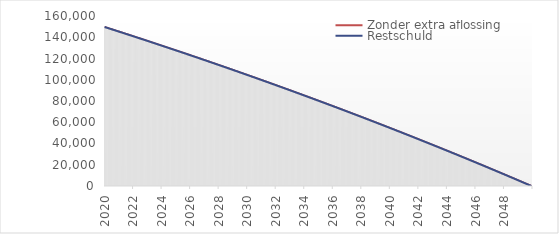
| Category | Zonder extra aflossing | Restschuld |
|---|---|---|
| 2020-01-01 | 149642.54 | 149642.54 |
| 2020-02-01 | 149284.78 | 149284.78 |
| 2020-03-01 | 148926.72 | 148926.72 |
| 2020-04-01 | 148568.37 | 148568.37 |
| 2020-05-01 | 148209.72 | 148209.72 |
| 2020-06-01 | 147850.77 | 147850.77 |
| 2020-07-01 | 147491.52 | 147491.52 |
| 2020-08-01 | 147131.97 | 147131.97 |
| 2020-09-01 | 146772.12 | 146772.12 |
| 2020-10-01 | 146411.97 | 146411.97 |
| 2020-11-01 | 146051.52 | 146051.52 |
| 2020-12-01 | 145690.77 | 145690.77 |
| 2021-01-01 | 145329.72 | 145329.72 |
| 2021-02-01 | 144968.37 | 144968.37 |
| 2021-03-01 | 144606.72 | 144606.72 |
| 2021-04-01 | 144244.77 | 144244.77 |
| 2021-05-01 | 143882.51 | 143882.51 |
| 2021-06-01 | 143519.95 | 143519.95 |
| 2021-07-01 | 143157.09 | 143157.09 |
| 2021-08-01 | 142793.93 | 142793.93 |
| 2021-09-01 | 142430.46 | 142430.46 |
| 2021-10-01 | 142066.69 | 142066.69 |
| 2021-11-01 | 141702.62 | 141702.62 |
| 2021-12-01 | 141338.25 | 141338.25 |
| 2022-01-01 | 140973.57 | 140973.57 |
| 2022-02-01 | 140608.59 | 140608.59 |
| 2022-03-01 | 140243.3 | 140243.3 |
| 2022-04-01 | 139877.71 | 139877.71 |
| 2022-05-01 | 139511.81 | 139511.81 |
| 2022-06-01 | 139145.61 | 139145.61 |
| 2022-07-01 | 138779.1 | 138779.1 |
| 2022-08-01 | 138412.29 | 138412.29 |
| 2022-09-01 | 138045.17 | 138045.17 |
| 2022-10-01 | 137677.75 | 137677.75 |
| 2022-11-01 | 137310.02 | 137310.02 |
| 2022-12-01 | 136941.99 | 136941.99 |
| 2023-01-01 | 136573.65 | 136573.65 |
| 2023-02-01 | 136205 | 136205 |
| 2023-03-01 | 135836.04 | 135836.04 |
| 2023-04-01 | 135466.78 | 135466.78 |
| 2023-05-01 | 135097.21 | 135097.21 |
| 2023-06-01 | 134727.33 | 134727.33 |
| 2023-07-01 | 134357.14 | 134357.14 |
| 2023-08-01 | 133986.64 | 133986.64 |
| 2023-09-01 | 133615.84 | 133615.84 |
| 2023-10-01 | 133244.73 | 133244.73 |
| 2023-11-01 | 132873.31 | 132873.31 |
| 2023-12-01 | 132501.58 | 132501.58 |
| 2024-01-01 | 132129.54 | 132129.54 |
| 2024-02-01 | 131757.19 | 131757.19 |
| 2024-03-01 | 131384.53 | 131384.53 |
| 2024-04-01 | 131011.56 | 131011.56 |
| 2024-05-01 | 130638.28 | 130638.28 |
| 2024-06-01 | 130264.69 | 130264.69 |
| 2024-07-01 | 129890.78 | 129890.78 |
| 2024-08-01 | 129516.56 | 129516.56 |
| 2024-09-01 | 129142.03 | 129142.03 |
| 2024-10-01 | 128767.19 | 128767.19 |
| 2024-11-01 | 128392.04 | 128392.04 |
| 2024-12-01 | 128016.57 | 128016.57 |
| 2025-01-01 | 127640.79 | 127640.79 |
| 2025-02-01 | 127264.7 | 127264.7 |
| 2025-03-01 | 126888.29 | 126888.29 |
| 2025-04-01 | 126511.57 | 126511.57 |
| 2025-05-01 | 126134.54 | 126134.54 |
| 2025-06-01 | 125757.19 | 125757.19 |
| 2025-07-01 | 125379.53 | 125379.53 |
| 2025-08-01 | 125001.55 | 125001.55 |
| 2025-09-01 | 124623.26 | 124623.26 |
| 2025-10-01 | 124244.65 | 124244.65 |
| 2025-11-01 | 123865.73 | 123865.73 |
| 2025-12-01 | 123486.49 | 123486.49 |
| 2026-01-01 | 123106.94 | 123106.94 |
| 2026-02-01 | 122727.07 | 122727.07 |
| 2026-03-01 | 122346.88 | 122346.88 |
| 2026-04-01 | 121966.38 | 121966.38 |
| 2026-05-01 | 121585.56 | 121585.56 |
| 2026-06-01 | 121204.42 | 121204.42 |
| 2026-07-01 | 120822.96 | 120822.96 |
| 2026-08-01 | 120441.19 | 120441.19 |
| 2026-09-01 | 120059.1 | 120059.1 |
| 2026-10-01 | 119676.69 | 119676.69 |
| 2026-11-01 | 119293.96 | 119293.96 |
| 2026-12-01 | 118910.91 | 118910.91 |
| 2027-01-01 | 118527.54 | 118527.54 |
| 2027-02-01 | 118143.85 | 118143.85 |
| 2027-03-01 | 117759.84 | 117759.84 |
| 2027-04-01 | 117375.51 | 117375.51 |
| 2027-05-01 | 116990.86 | 116990.86 |
| 2027-06-01 | 116605.89 | 116605.89 |
| 2027-07-01 | 116220.6 | 116220.6 |
| 2027-08-01 | 115834.99 | 115834.99 |
| 2027-09-01 | 115449.06 | 115449.06 |
| 2027-10-01 | 115062.81 | 115062.81 |
| 2027-11-01 | 114676.24 | 114676.24 |
| 2027-12-01 | 114289.34 | 114289.34 |
| 2028-01-01 | 113902.12 | 113902.12 |
| 2028-02-01 | 113514.58 | 113514.58 |
| 2028-03-01 | 113126.72 | 113126.72 |
| 2028-04-01 | 112738.53 | 112738.53 |
| 2028-05-01 | 112350.02 | 112350.02 |
| 2028-06-01 | 111961.19 | 111961.19 |
| 2028-07-01 | 111572.03 | 111572.03 |
| 2028-08-01 | 111182.55 | 111182.55 |
| 2028-09-01 | 110792.74 | 110792.74 |
| 2028-10-01 | 110402.61 | 110402.61 |
| 2028-11-01 | 110012.15 | 110012.15 |
| 2028-12-01 | 109621.37 | 109621.37 |
| 2029-01-01 | 109230.26 | 109230.26 |
| 2029-02-01 | 108838.83 | 108838.83 |
| 2029-03-01 | 108447.07 | 108447.07 |
| 2029-04-01 | 108054.98 | 108054.98 |
| 2029-05-01 | 107662.57 | 107662.57 |
| 2029-06-01 | 107269.83 | 107269.83 |
| 2029-07-01 | 106876.76 | 106876.76 |
| 2029-08-01 | 106483.36 | 106483.36 |
| 2029-09-01 | 106089.64 | 106089.64 |
| 2029-10-01 | 105695.59 | 105695.59 |
| 2029-11-01 | 105301.21 | 105301.21 |
| 2029-12-01 | 104906.5 | 104906.5 |
| 2030-01-01 | 104511.46 | 104511.46 |
| 2030-02-01 | 104116.09 | 104116.09 |
| 2030-03-01 | 103720.39 | 103720.39 |
| 2030-04-01 | 103324.36 | 103324.36 |
| 2030-05-01 | 102928 | 102928 |
| 2030-06-01 | 102531.31 | 102531.31 |
| 2030-07-01 | 102134.29 | 102134.29 |
| 2030-08-01 | 101736.94 | 101736.94 |
| 2030-09-01 | 101339.26 | 101339.26 |
| 2030-10-01 | 100941.25 | 100941.25 |
| 2030-11-01 | 100542.91 | 100542.91 |
| 2030-12-01 | 100144.24 | 100144.24 |
| 2031-01-01 | 99745.23 | 99745.23 |
| 2031-02-01 | 99345.89 | 99345.89 |
| 2031-03-01 | 98946.22 | 98946.22 |
| 2031-04-01 | 98546.22 | 98546.22 |
| 2031-05-01 | 98145.88 | 98145.88 |
| 2031-06-01 | 97745.21 | 97745.21 |
| 2031-07-01 | 97344.2 | 97344.2 |
| 2031-08-01 | 96942.86 | 96942.86 |
| 2031-09-01 | 96541.19 | 96541.19 |
| 2031-10-01 | 96139.18 | 96139.18 |
| 2031-11-01 | 95736.84 | 95736.84 |
| 2031-12-01 | 95334.16 | 95334.16 |
| 2032-01-01 | 94931.15 | 94931.15 |
| 2032-02-01 | 94527.8 | 94527.8 |
| 2032-03-01 | 94124.11 | 94124.11 |
| 2032-04-01 | 93720.09 | 93720.09 |
| 2032-05-01 | 93315.73 | 93315.73 |
| 2032-06-01 | 92911.03 | 92911.03 |
| 2032-07-01 | 92506 | 92506 |
| 2032-08-01 | 92100.63 | 92100.63 |
| 2032-09-01 | 91694.92 | 91694.92 |
| 2032-10-01 | 91288.87 | 91288.87 |
| 2032-11-01 | 90882.48 | 90882.48 |
| 2032-12-01 | 90475.76 | 90475.76 |
| 2033-01-01 | 90068.7 | 90068.7 |
| 2033-02-01 | 89661.3 | 89661.3 |
| 2033-03-01 | 89253.56 | 89253.56 |
| 2033-04-01 | 88845.48 | 88845.48 |
| 2033-05-01 | 88437.06 | 88437.06 |
| 2033-06-01 | 88028.3 | 88028.3 |
| 2033-07-01 | 87619.2 | 87619.2 |
| 2033-08-01 | 87209.76 | 87209.76 |
| 2033-09-01 | 86799.97 | 86799.97 |
| 2033-10-01 | 86389.84 | 86389.84 |
| 2033-11-01 | 85979.37 | 85979.37 |
| 2033-12-01 | 85568.56 | 85568.56 |
| 2034-01-01 | 85157.41 | 85157.41 |
| 2034-02-01 | 84745.91 | 84745.91 |
| 2034-03-01 | 84334.07 | 84334.07 |
| 2034-04-01 | 83921.89 | 83921.89 |
| 2034-05-01 | 83509.36 | 83509.36 |
| 2034-06-01 | 83096.49 | 83096.49 |
| 2034-07-01 | 82683.28 | 82683.28 |
| 2034-08-01 | 82269.72 | 82269.72 |
| 2034-09-01 | 81855.82 | 81855.82 |
| 2034-10-01 | 81441.57 | 81441.57 |
| 2034-11-01 | 81026.98 | 81026.98 |
| 2034-12-01 | 80612.04 | 80612.04 |
| 2035-01-01 | 80196.76 | 80196.76 |
| 2035-02-01 | 79781.13 | 79781.13 |
| 2035-03-01 | 79365.15 | 79365.15 |
| 2035-04-01 | 78948.83 | 78948.83 |
| 2035-05-01 | 78532.16 | 78532.16 |
| 2035-06-01 | 78115.14 | 78115.14 |
| 2035-07-01 | 77697.78 | 77697.78 |
| 2035-08-01 | 77280.07 | 77280.07 |
| 2035-09-01 | 76862.01 | 76862.01 |
| 2035-10-01 | 76443.6 | 76443.6 |
| 2035-11-01 | 76024.84 | 76024.84 |
| 2035-12-01 | 75605.73 | 75605.73 |
| 2036-01-01 | 75186.27 | 75186.27 |
| 2036-02-01 | 74766.47 | 74766.47 |
| 2036-03-01 | 74346.32 | 74346.32 |
| 2036-04-01 | 73925.82 | 73925.82 |
| 2036-05-01 | 73504.96 | 73504.96 |
| 2036-06-01 | 73083.75 | 73083.75 |
| 2036-07-01 | 72662.19 | 72662.19 |
| 2036-08-01 | 72240.28 | 72240.28 |
| 2036-09-01 | 71818.02 | 71818.02 |
| 2036-10-01 | 71395.41 | 71395.41 |
| 2036-11-01 | 70972.45 | 70972.45 |
| 2036-12-01 | 70549.13 | 70549.13 |
| 2037-01-01 | 70125.46 | 70125.46 |
| 2037-02-01 | 69701.44 | 69701.44 |
| 2037-03-01 | 69277.06 | 69277.06 |
| 2037-04-01 | 68852.33 | 68852.33 |
| 2037-05-01 | 68427.25 | 68427.25 |
| 2037-06-01 | 68001.81 | 68001.81 |
| 2037-07-01 | 67576.02 | 67576.02 |
| 2037-08-01 | 67149.87 | 67149.87 |
| 2037-09-01 | 66723.37 | 66723.37 |
| 2037-10-01 | 66296.51 | 66296.51 |
| 2037-11-01 | 65869.3 | 65869.3 |
| 2037-12-01 | 65441.73 | 65441.73 |
| 2038-01-01 | 65013.8 | 65013.8 |
| 2038-02-01 | 64585.52 | 64585.52 |
| 2038-03-01 | 64156.88 | 64156.88 |
| 2038-04-01 | 63727.88 | 63727.88 |
| 2038-05-01 | 63298.53 | 63298.53 |
| 2038-06-01 | 62868.82 | 62868.82 |
| 2038-07-01 | 62438.75 | 62438.75 |
| 2038-08-01 | 62008.32 | 62008.32 |
| 2038-09-01 | 61577.53 | 61577.53 |
| 2038-10-01 | 61146.38 | 61146.38 |
| 2038-11-01 | 60714.88 | 60714.88 |
| 2038-12-01 | 60283.02 | 60283.02 |
| 2039-01-01 | 59850.8 | 59850.8 |
| 2039-02-01 | 59418.22 | 59418.22 |
| 2039-03-01 | 58985.28 | 58985.28 |
| 2039-04-01 | 58551.97 | 58551.97 |
| 2039-05-01 | 58118.3 | 58118.3 |
| 2039-06-01 | 57684.27 | 57684.27 |
| 2039-07-01 | 57249.88 | 57249.88 |
| 2039-08-01 | 56815.13 | 56815.13 |
| 2039-09-01 | 56380.02 | 56380.02 |
| 2039-10-01 | 55944.54 | 55944.54 |
| 2039-11-01 | 55508.7 | 55508.7 |
| 2039-12-01 | 55072.5 | 55072.5 |
| 2040-01-01 | 54635.93 | 54635.93 |
| 2040-02-01 | 54199 | 54199 |
| 2040-03-01 | 53761.71 | 53761.71 |
| 2040-04-01 | 53324.05 | 53324.05 |
| 2040-05-01 | 52886.03 | 52886.03 |
| 2040-06-01 | 52447.64 | 52447.64 |
| 2040-07-01 | 52008.89 | 52008.89 |
| 2040-08-01 | 51569.77 | 51569.77 |
| 2040-09-01 | 51130.28 | 51130.28 |
| 2040-10-01 | 50690.43 | 50690.43 |
| 2040-11-01 | 50250.21 | 50250.21 |
| 2040-12-01 | 49809.63 | 49809.63 |
| 2041-01-01 | 49368.68 | 49368.68 |
| 2041-02-01 | 48927.36 | 48927.36 |
| 2041-03-01 | 48485.67 | 48485.67 |
| 2041-04-01 | 48043.61 | 48043.61 |
| 2041-05-01 | 47601.19 | 47601.19 |
| 2041-06-01 | 47158.4 | 47158.4 |
| 2041-07-01 | 46715.24 | 46715.24 |
| 2041-08-01 | 46271.71 | 46271.71 |
| 2041-09-01 | 45827.81 | 45827.81 |
| 2041-10-01 | 45383.54 | 45383.54 |
| 2041-11-01 | 44938.9 | 44938.9 |
| 2041-12-01 | 44493.89 | 44493.89 |
| 2042-01-01 | 44048.51 | 44048.51 |
| 2042-02-01 | 43602.76 | 43602.76 |
| 2042-03-01 | 43156.64 | 43156.64 |
| 2042-04-01 | 42710.14 | 42710.14 |
| 2042-05-01 | 42263.27 | 42263.27 |
| 2042-06-01 | 41816.03 | 41816.03 |
| 2042-07-01 | 41368.42 | 41368.42 |
| 2042-08-01 | 40920.43 | 40920.43 |
| 2042-09-01 | 40472.07 | 40472.07 |
| 2042-10-01 | 40023.34 | 40023.34 |
| 2042-11-01 | 39574.23 | 39574.23 |
| 2042-12-01 | 39124.75 | 39124.75 |
| 2043-01-01 | 38674.89 | 38674.89 |
| 2043-02-01 | 38224.66 | 38224.66 |
| 2043-03-01 | 37774.05 | 37774.05 |
| 2043-04-01 | 37323.07 | 37323.07 |
| 2043-05-01 | 36871.71 | 36871.71 |
| 2043-06-01 | 36419.98 | 36419.98 |
| 2043-07-01 | 35967.87 | 35967.87 |
| 2043-08-01 | 35515.38 | 35515.38 |
| 2043-09-01 | 35062.52 | 35062.52 |
| 2043-10-01 | 34609.28 | 34609.28 |
| 2043-11-01 | 34155.66 | 34155.66 |
| 2043-12-01 | 33701.66 | 33701.66 |
| 2044-01-01 | 33247.28 | 33247.28 |
| 2044-02-01 | 32792.53 | 32792.53 |
| 2044-03-01 | 32337.4 | 32337.4 |
| 2044-04-01 | 31881.89 | 31881.89 |
| 2044-05-01 | 31426 | 31426 |
| 2044-06-01 | 30969.73 | 30969.73 |
| 2044-07-01 | 30513.08 | 30513.08 |
| 2044-08-01 | 30056.05 | 30056.05 |
| 2044-09-01 | 29598.64 | 29598.64 |
| 2044-10-01 | 29140.85 | 29140.85 |
| 2044-11-01 | 28682.67 | 28682.67 |
| 2044-12-01 | 28224.11 | 28224.11 |
| 2045-01-01 | 27765.17 | 27765.17 |
| 2045-02-01 | 27305.85 | 27305.85 |
| 2045-03-01 | 26846.14 | 26846.14 |
| 2045-04-01 | 26386.05 | 26386.05 |
| 2045-05-01 | 25925.58 | 25925.58 |
| 2045-06-01 | 25464.72 | 25464.72 |
| 2045-07-01 | 25003.48 | 25003.48 |
| 2045-08-01 | 24541.86 | 24541.86 |
| 2045-09-01 | 24079.85 | 24079.85 |
| 2045-10-01 | 23617.46 | 23617.46 |
| 2045-11-01 | 23154.68 | 23154.68 |
| 2045-12-01 | 22691.52 | 22691.52 |
| 2046-01-01 | 22227.97 | 22227.97 |
| 2046-02-01 | 21764.03 | 21764.03 |
| 2046-03-01 | 21299.71 | 21299.71 |
| 2046-04-01 | 20835 | 20835 |
| 2046-05-01 | 20369.9 | 20369.9 |
| 2046-06-01 | 19904.41 | 19904.41 |
| 2046-07-01 | 19438.54 | 19438.54 |
| 2046-08-01 | 18972.28 | 18972.28 |
| 2046-09-01 | 18505.63 | 18505.63 |
| 2046-10-01 | 18038.59 | 18038.59 |
| 2046-11-01 | 17571.16 | 17571.16 |
| 2046-12-01 | 17103.34 | 17103.34 |
| 2047-01-01 | 16635.13 | 16635.13 |
| 2047-02-01 | 16166.53 | 16166.53 |
| 2047-03-01 | 15697.54 | 15697.54 |
| 2047-04-01 | 15228.16 | 15228.16 |
| 2047-05-01 | 14758.39 | 14758.39 |
| 2047-06-01 | 14288.23 | 14288.23 |
| 2047-07-01 | 13817.68 | 13817.68 |
| 2047-08-01 | 13346.73 | 13346.73 |
| 2047-09-01 | 12875.39 | 12875.39 |
| 2047-10-01 | 12403.66 | 12403.66 |
| 2047-11-01 | 11931.54 | 11931.54 |
| 2047-12-01 | 11459.02 | 11459.02 |
| 2048-01-01 | 10986.11 | 10986.11 |
| 2048-02-01 | 10512.81 | 10512.81 |
| 2048-03-01 | 10039.11 | 10039.11 |
| 2048-04-01 | 9565.02 | 9565.02 |
| 2048-05-01 | 9090.53 | 9090.53 |
| 2048-06-01 | 8615.65 | 8615.65 |
| 2048-07-01 | 8140.37 | 8140.37 |
| 2048-08-01 | 7664.69 | 7664.69 |
| 2048-09-01 | 7188.62 | 7188.62 |
| 2048-10-01 | 6712.15 | 6712.15 |
| 2048-11-01 | 6235.28 | 6235.28 |
| 2048-12-01 | 5758.02 | 5758.02 |
| 2049-01-01 | 5280.36 | 5280.36 |
| 2049-02-01 | 4802.3 | 4802.3 |
| 2049-03-01 | 4323.84 | 4323.84 |
| 2049-04-01 | 3844.98 | 3844.98 |
| 2049-05-01 | 3365.72 | 3365.72 |
| 2049-06-01 | 2886.06 | 2886.06 |
| 2049-07-01 | 2406.01 | 2406.01 |
| 2049-08-01 | 1925.56 | 1925.56 |
| 2049-09-01 | 1444.7 | 1444.7 |
| 2049-10-01 | 963.44 | 963.44 |
| 2049-11-01 | 481.78 | 481.78 |
| 2049-12-01 | 0 | 0 |